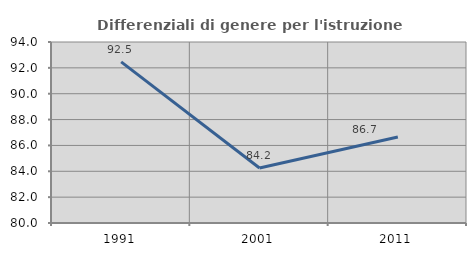
| Category | Differenziali di genere per l'istruzione superiore |
|---|---|
| 1991.0 | 92.46 |
| 2001.0 | 84.25 |
| 2011.0 | 86.653 |